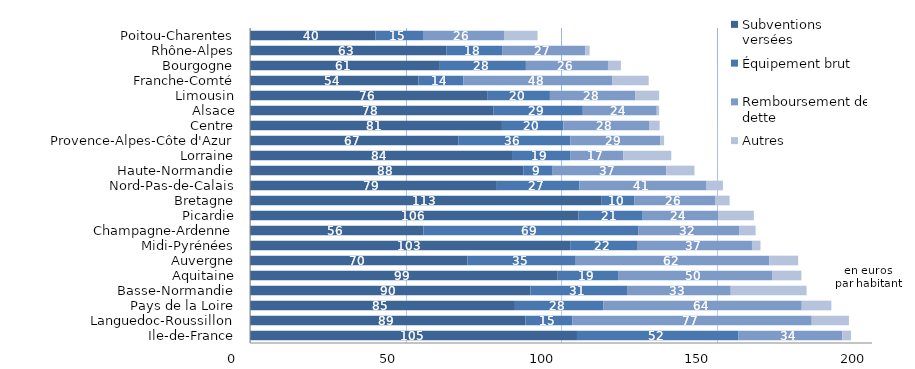
| Category | Subventions versées | Équipement brut | Remboursement de dette | Autres |
|---|---|---|---|---|
| Ile-de-France | 105.134 | 51.834 | 33.505 | 2.767 |
| Languedoc-Roussillon | 88.547 | 15.15 | 76.92 | 11.973 |
| Pays de la Loire | 85.185 | 28.485 | 63.745 | 9.522 |
| Basse-Normandie | 90.195 | 31.041 | 33.342 | 24.385 |
| Aquitaine | 98.952 | 19.396 | 49.681 | 9.269 |
| Auvergne | 69.946 | 34.799 | 62.252 | 9.261 |
| Midi-Pyrénées | 102.955 | 21.72 | 36.733 | 2.729 |
| Champagne-Ardenne | 55.794 | 69.153 | 32.297 | 5.326 |
| Picardie | 105.632 | 20.649 | 24.215 | 11.507 |
| Bretagne | 113.099 | 10.426 | 25.992 | 4.701 |
| Nord-Pas-de-Calais | 79.374 | 26.555 | 40.894 | 5.247 |
| Haute-Normandie | 87.989 | 9.335 | 36.539 | 9.057 |
| Lorraine | 84.248 | 18.679 | 17.121 | 15.413 |
| Provence-Alpes-Côte d'Azur | 66.976 | 36.069 | 28.812 | 1.299 |
| Centre | 81.011 | 19.759 | 27.708 | 3.25 |
| Alsace | 78.35 | 28.663 | 23.778 | 0.769 |
| Limousin | 76.253 | 20.189 | 27.522 | 7.592 |
| Franche-Comté | 54.195 | 14.368 | 48.001 | 11.643 |
| Bourgogne | 61.04 | 27.675 | 26.392 | 4.159 |
| Rhône-Alpes | 63.098 | 17.96 | 26.727 | 1.415 |
| Poitou-Charentes | 40.361 | 15.263 | 26.044 | 10.787 |